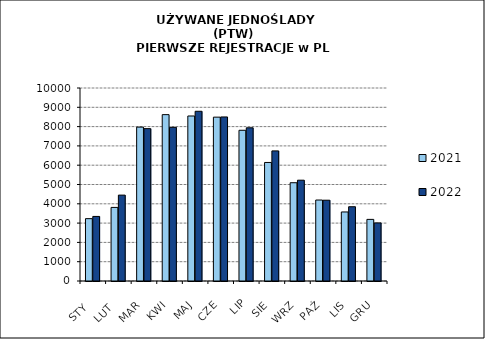
| Category | 2021 | 2022 |
|---|---|---|
|  STY  | 3231 | 3346 |
|  LUT  | 3813 | 4450 |
| MAR | 7974 | 7895 |
| KWI | 8620 | 7963 |
| MAJ | 8550 | 8794 |
| CZE | 8490 | 8500 |
| LIP | 7810 | 7938 |
| SIE | 6142 | 6742 |
| WRZ | 5092 | 5223 |
| PAŹ | 4196 | 4186 |
| LIS | 3577 | 3848 |
| GRU | 3193 | 3010 |